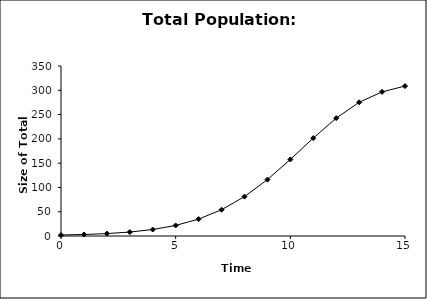
| Category | Total pop |
|---|---|
| 0.0 | 2 |
| 1.0 | 3.1 |
| 2.0 | 4.973 |
| 3.0 | 8.124 |
| 4.0 | 13.33 |
| 5.0 | 21.714 |
| 6.0 | 34.751 |
| 7.0 | 54.089 |
| 8.0 | 81.096 |
| 9.0 | 116.105 |
| 10.0 | 157.566 |
| 11.0 | 201.605 |
| 12.0 | 242.62 |
| 13.0 | 275.176 |
| 14.0 | 296.733 |
| 15.0 | 308.719 |